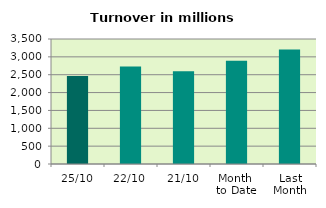
| Category | Series 0 |
|---|---|
| 25/10 | 2463.835 |
| 22/10 | 2727.248 |
| 21/10 | 2598.841 |
| Month 
to Date | 2889.349 |
| Last
Month | 3204.516 |